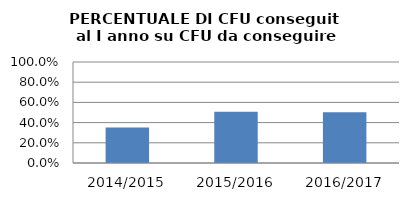
| Category | 2014/2015 2015/2016 2016/2017 |
|---|---|
| 2014/2015 | 0.35 |
| 2015/2016 | 0.507 |
| 2016/2017 | 0.503 |